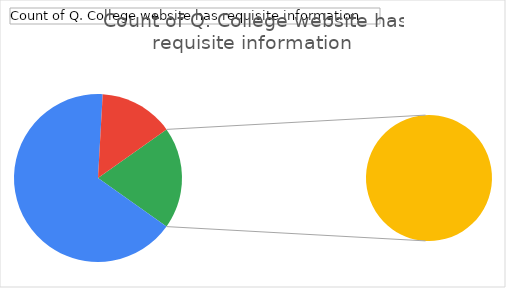
| Category | Total |
|---|---|
| Agree | 37 |
| Dsagree | 8 |
| Neutral | 11 |